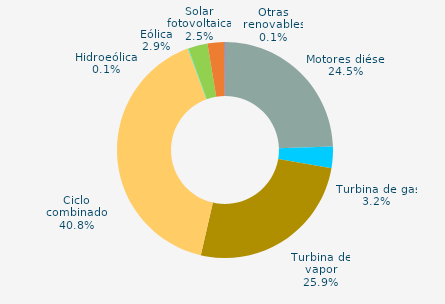
| Category | Series 0 |
|---|---|
| Motores diésel | 24.5 |
| Turbina de gas | 3.2 |
| Turbina de vapor | 25.9 |
| Ciclo combinado | 40.8 |
| Cogeneración | 0 |
| Hidráulica | 0 |
| Hidroeólica | 0.1 |
| Eólica | 2.9 |
| Solar fotovoltaica | 2.5 |
| Otras renovables | 0.1 |